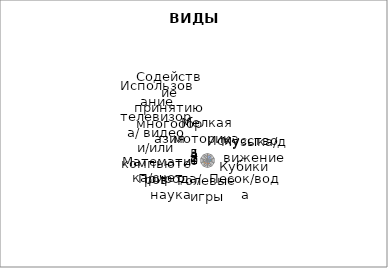
| Category | Series 0 | Series 1 | Series 2 | Series 3 | Series 4 | Series 5 | Series 6 |
|---|---|---|---|---|---|---|---|
| Мелкая моторика | 4 | 2 | 4 | 4 | 4 | 5 | 3.833 |
| Искусство | 3 | 3 | 3 | 3 | 3 | 3 | 3.833 |
| Музыка/движение | 2 | 3 | 3 | 3 | 3 | 3 | 2.833 |
| Кубики | 1 | 1 | 1 | 1 | 2 | 1 | 1.167 |
| Песок/вода | 1 | 3 | 3 | 3 | 3 | 3 | 2.667 |
| Ролевые игры | 1 | 2 | 1 | 1 | 1 | 2 | 1.333 |
| Природа/ наука | 2 | 1 | 2 | 1 | 3 | 3 | 2 |
| Математика/счет | 2 | 3 | 4 | 3 | 3 | 3 | 3 |
| Использование телевизора/ видео и/или компьютеров | 1 | 0 | 0 | 0 | 0 | 0 | 0.167 |
| Содействие принятию многообразия | 1 | 1 | 1 | 1 | 1 | 1 | 1 |